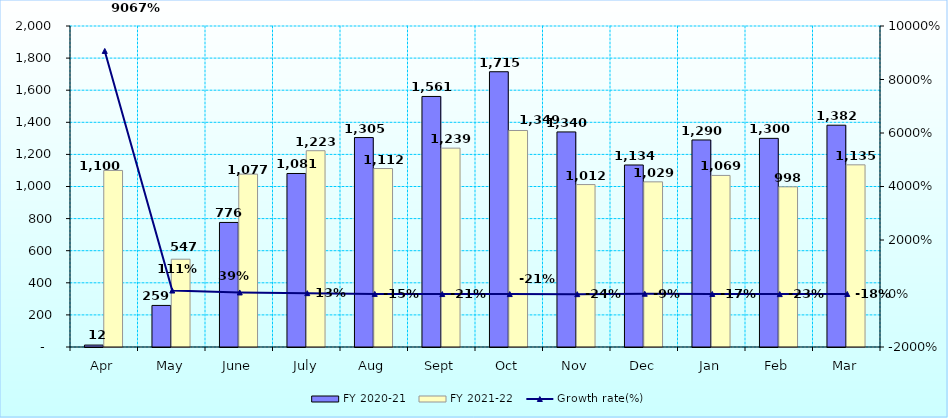
| Category | FY 2020-21 | FY 2021-22 |
|---|---|---|
| Apr | 12 | 1100 |
| May | 259 | 547 |
| June | 776 | 1077 |
| July | 1081 | 1223 |
| Aug | 1305 | 1112 |
| Sept | 1561 | 1239 |
| Oct | 1715 | 1349 |
| Nov | 1340 | 1012 |
| Dec | 1134 | 1029 |
| Jan | 1290 | 1069 |
| Feb | 1300 | 998 |
| Mar | 1382 | 1135 |